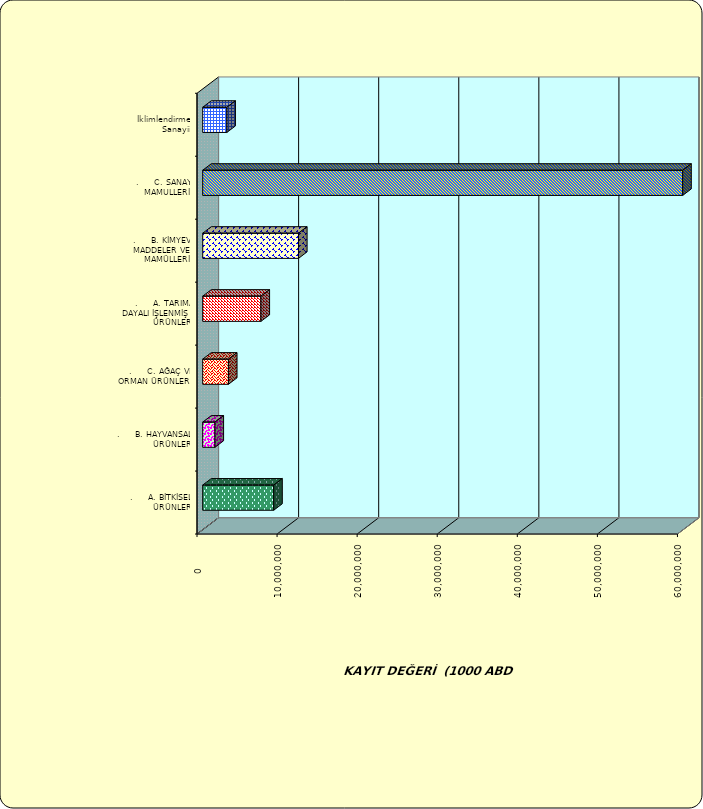
| Category | Series 0 |
|---|---|
| .     A. BİTKİSEL ÜRÜNLER | 8868420.27 |
| .     B. HAYVANSAL ÜRÜNLER | 1533967.636 |
| .     C. AĞAÇ VE ORMAN ÜRÜNLERİ | 3214154.11 |
| .     A. TARIMA DAYALI İŞLENMİŞ ÜRÜNLER | 7277123.261 |
| .     B. KİMYEVİ MADDELER VE MAMÜLLERİ | 11963625.63 |
| .     C. SANAYİ MAMULLERİ | 59943203.773 |
|  İklimlendirme Sanayii | 3014643.596 |